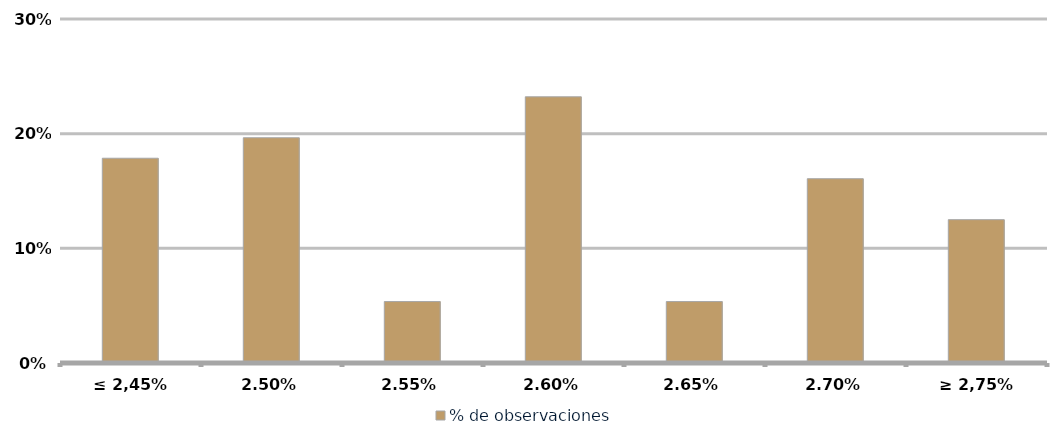
| Category | % de observaciones  |
|---|---|
| ≤ 2,45% | 0.179 |
| 2,50% | 0.196 |
| 2,55% | 0.054 |
| 2,60% | 0.232 |
| 2,65% | 0.054 |
| 2,70% | 0.161 |
| ≥ 2,75% | 0.125 |